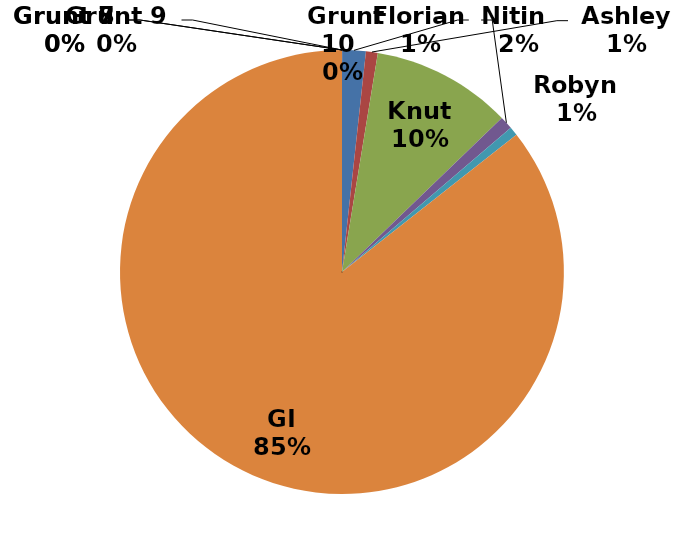
| Category | Series 0 |
|---|---|
|  Nitin   | 0.017 |
|  Ashley  | 0.009 |
|  Knut  | 0.102 |
|  Florian  | 0.01 |
|  Robyn  | 0.006 |
|  GI  | 0.856 |
|  Grunt 7  | 0 |
|  Grunt 8  | 0 |
|  Grunt 9  | 0 |
|  Grunt 10  | 0 |